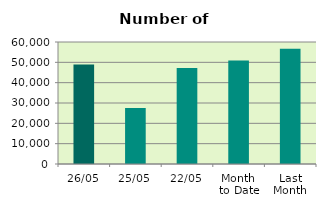
| Category | Series 0 |
|---|---|
| 26/05 | 48992 |
| 25/05 | 27540 |
| 22/05 | 47178 |
| Month 
to Date | 50932.353 |
| Last
Month | 56719.3 |